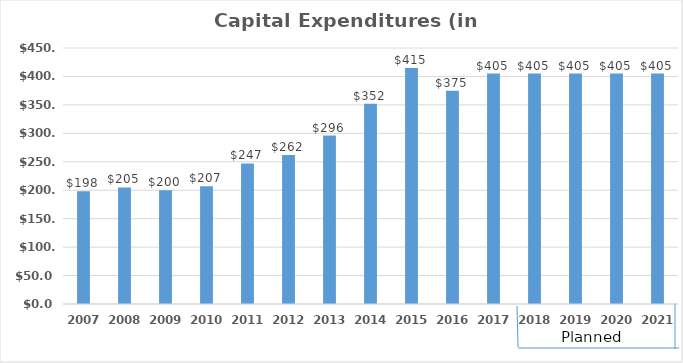
| Category | Capital Expenditures |
|---|---|
| 2007.0 | 198 |
| 2008.0 | 205 |
| 2009.0 | 200 |
| 2010.0 | 207 |
| 2011.0 | 247 |
| 2012.0 | 262 |
| 2013.0 | 296 |
| 2014.0 | 352 |
| 2015.0 | 415 |
| 2016.0 | 375 |
| 2017.0 | 405 |
| 2018.0 | 405 |
| 2019.0 | 405 |
| 2020.0 | 405 |
| 2021.0 | 405 |